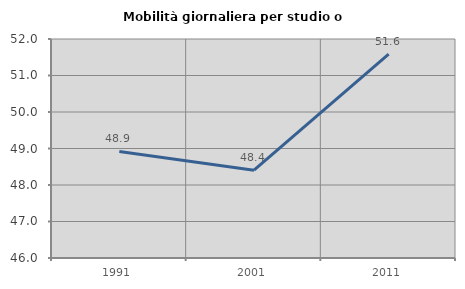
| Category | Mobilità giornaliera per studio o lavoro |
|---|---|
| 1991.0 | 48.919 |
| 2001.0 | 48.406 |
| 2011.0 | 51.585 |